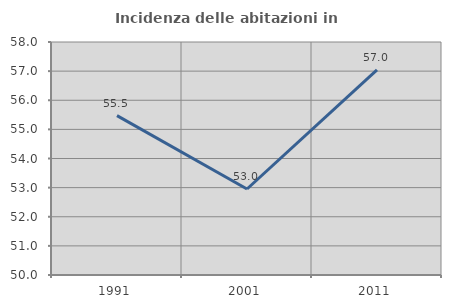
| Category | Incidenza delle abitazioni in proprietà  |
|---|---|
| 1991.0 | 55.471 |
| 2001.0 | 52.953 |
| 2011.0 | 57.041 |